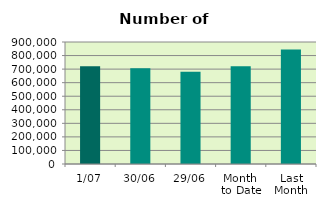
| Category | Series 0 |
|---|---|
| 1/07 | 720982 |
| 30/06 | 706304 |
| 29/06 | 680618 |
| Month 
to Date | 720982 |
| Last
Month | 844724.182 |